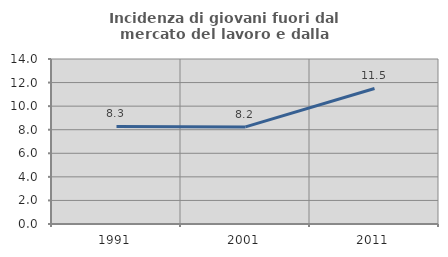
| Category | Incidenza di giovani fuori dal mercato del lavoro e dalla formazione  |
|---|---|
| 1991.0 | 8.277 |
| 2001.0 | 8.239 |
| 2011.0 | 11.498 |